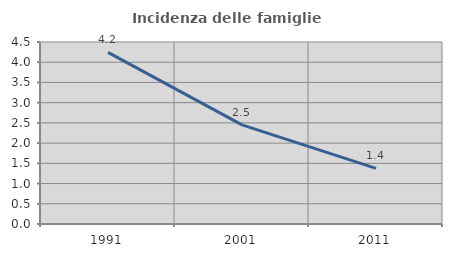
| Category | Incidenza delle famiglie numerose |
|---|---|
| 1991.0 | 4.245 |
| 2001.0 | 2.451 |
| 2011.0 | 1.375 |